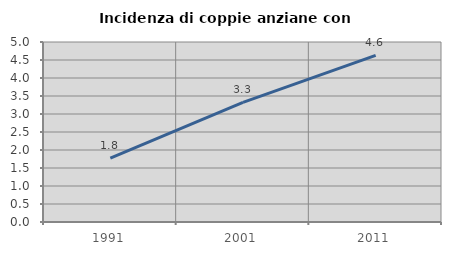
| Category | Incidenza di coppie anziane con figli |
|---|---|
| 1991.0 | 1.776 |
| 2001.0 | 3.321 |
| 2011.0 | 4.626 |